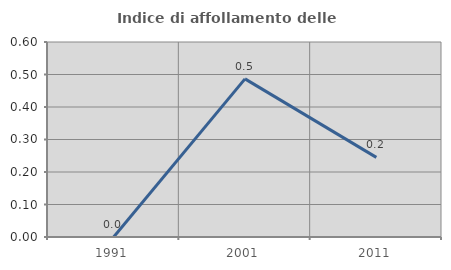
| Category | Indice di affollamento delle abitazioni  |
|---|---|
| 1991.0 | 0 |
| 2001.0 | 0.487 |
| 2011.0 | 0.245 |